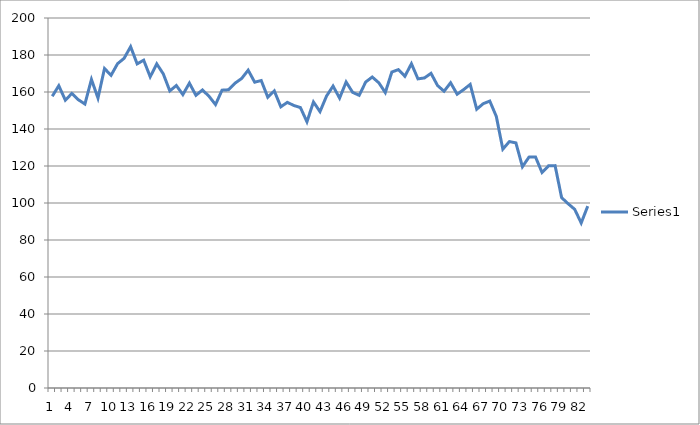
| Category | Series 0 |
|---|---|
| 0 | 157.7 |
| 1 | 163.4 |
| 2 | 155.6 |
| 3 | 159.2 |
| 4 | 155.8 |
| 5 | 153.5 |
| 6 | 166.8 |
| 7 | 156.7 |
| 8 | 172.7 |
| 9 | 169 |
| 10 | 175.3 |
| 11 | 178.2 |
| 12 | 184.5 |
| 13 | 175.2 |
| 14 | 177.2 |
| 15 | 168.2 |
| 16 | 175.2 |
| 17 | 169.8 |
| 18 | 160.6 |
| 19 | 163.5 |
| 20 | 158.6 |
| 21 | 164.8 |
| 22 | 158.2 |
| 23 | 161.1 |
| 24 | 157.7 |
| 25 | 153.2 |
| 26 | 161 |
| 27 | 161.2 |
| 28 | 164.8 |
| 29 | 167.3 |
| 30 | 171.8 |
| 31 | 165.3 |
| 32 | 166.2 |
| 33 | 157.2 |
| 34 | 160.6 |
| 35 | 152 |
| 36 | 154.4 |
| 37 | 152.7 |
| 38 | 151.6 |
| 39 | 143.9 |
| 40 | 154.6 |
| 41 | 149.4 |
| 42 | 157.8 |
| 43 | 163.2 |
| 44 | 156.7 |
| 45 | 165.4 |
| 46 | 159.8 |
| 47 | 158.2 |
| 48 | 165.4 |
| 49 | 168.1 |
| 50 | 165 |
| 51 | 159.7 |
| 52 | 170.8 |
| 53 | 172.1 |
| 54 | 168.5 |
| 55 | 175.3 |
| 56 | 167.1 |
| 57 | 167.6 |
| 58 | 170.1 |
| 59 | 163.5 |
| 60 | 160.4 |
| 61 | 165 |
| 62 | 158.8 |
| 63 | 161.3 |
| 64 | 164.1 |
| 65 | 150.7 |
| 66 | 153.7 |
| 67 | 155.1 |
| 68 | 146.8 |
| 69 | 129.1 |
| 70 | 133.2 |
| 71 | 132.5 |
| 72 | 119.6 |
| 73 | 124.8 |
| 74 | 124.9 |
| 75 | 116.5 |
| 76 | 120.1 |
| 77 | 120.2 |
| 78 | 102.9 |
| 79 | 99.6 |
| 80 | 96.6 |
| 81 | 89.2 |
| 82 | 98.3 |